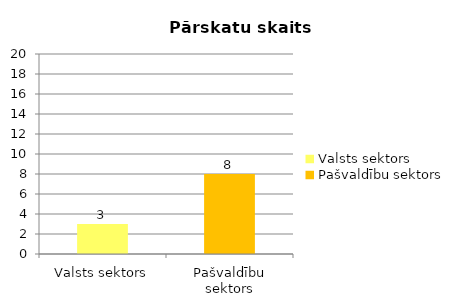
| Category |  Pārskatu skaits |
|---|---|
| Valsts sektors | 3 |
| Pašvaldību sektors | 8 |